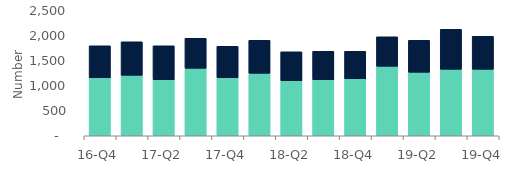
| Category | Homeowners | Buy-to-let |
|---|---|---|
| 16-Q4 | 1160 | 640 |
| 17-Q1 | 1210 | 670 |
| 17-Q2 | 1120 | 680 |
| 17-Q3 | 1350 | 600 |
| 17-Q4 | 1160 | 630 |
| 18-Q1 | 1250 | 660 |
| 18-Q2 | 1100 | 580 |
| 18-Q3 | 1120 | 570 |
| 18-Q4 | 1140 | 550 |
| 19-Q1 | 1390 | 590 |
| 19-Q2 | 1270 | 640 |
| 19-Q3 | 1330 | 800 |
| 19-Q4 | 1330 | 660 |